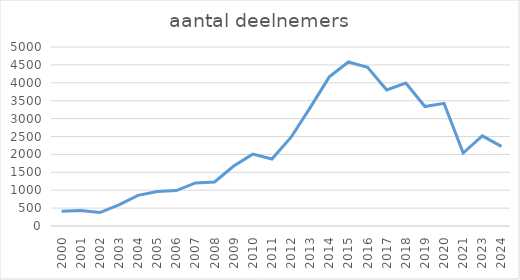
| Category | aantal deelnemers |
|---|---|
| 2000.0 | 410 |
| 2001.0 | 436 |
| 2002.0 | 376 |
| 2003.0 | 588 |
| 2004.0 | 857 |
| 2005.0 | 966 |
| 2006.0 | 991 |
| 2007.0 | 1202 |
| 2008.0 | 1229 |
| 2009.0 | 1676 |
| 2010.0 | 2008 |
| 2011.0 | 1872 |
| 2012.0 | 2480 |
| 2013.0 | 3307 |
| 2014.0 | 4165 |
| 2015.0 | 4582 |
| 2016.0 | 4434 |
| 2017.0 | 3798 |
| 2018.0 | 3993 |
| 2019.0 | 3337 |
| 2020.0 | 3426 |
| 2021.0 | 2038 |
| 2023.0 | 2518 |
| 2024.0 | 2226 |